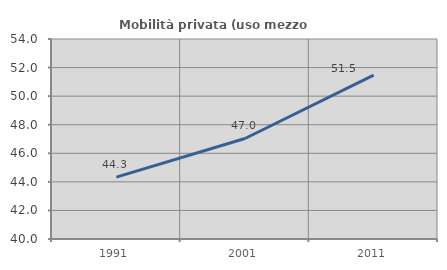
| Category | Mobilità privata (uso mezzo privato) |
|---|---|
| 1991.0 | 44.333 |
| 2001.0 | 47.036 |
| 2011.0 | 51.476 |